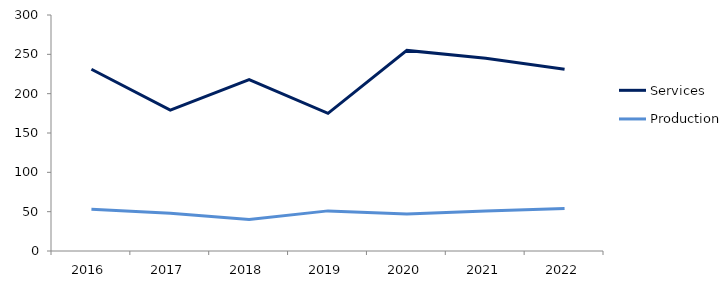
| Category | Services | Production |
|---|---|---|
| 2016.0 | 231 | 53 |
| 2017.0 | 179 | 48 |
| 2018.0 | 218 | 40 |
| 2019.0 | 175 | 51 |
| 2020.0 | 255 | 47 |
| 2021.0 | 245 | 51 |
| 2022.0 | 231 | 54 |